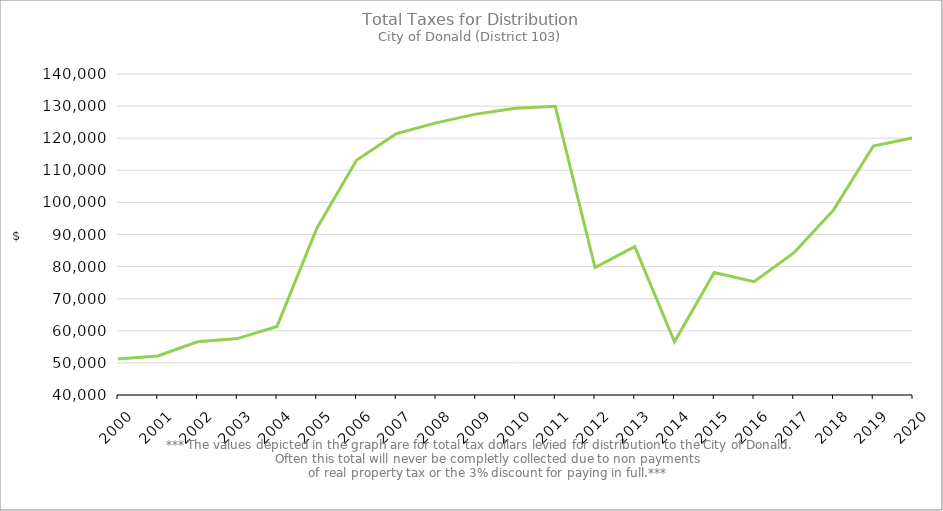
| Category | Series 0 |
|---|---|
| 2000.0 | 51196.59 |
| 2001.0 | 52164.8 |
| 2002.0 | 56570.95 |
| 2003.0 | 57576.66 |
| 2004.0 | 61365.7 |
| 2005.0 | 91906.88 |
| 2006.0 | 113141.89 |
| 2007.0 | 121405.24 |
| 2008.0 | 124778.66 |
| 2009.0 | 127505.57 |
| 2010.0 | 129314.03 |
| 2011.0 | 129946.48 |
| 2012.0 | 79719.41 |
| 2013.0 | 86240.8 |
| 2014.0 | 56583.04 |
| 2015.0 | 78176.45 |
| 2016.0 | 75307.19 |
| 2017.0 | 84256.78 |
| 2018.0 | 97634.63 |
| 2019.0 | 117525.39 |
| 2020.0 | 120148.82 |